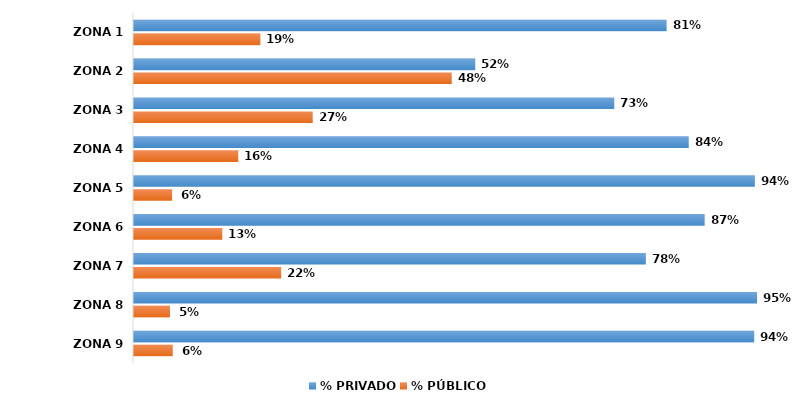
| Category | % PRIVADO | % PÚBLICO |
|---|---|---|
| ZONA 1 | 0.808 | 0.192 |
| ZONA 2 | 0.518 | 0.482 |
| ZONA 3 | 0.729 | 0.271 |
| ZONA 4 | 0.842 | 0.158 |
| ZONA 5 | 0.942 | 0.058 |
| ZONA 6 | 0.866 | 0.134 |
| ZONA 7 | 0.777 | 0.223 |
| ZONA 8 | 0.945 | 0.055 |
| ZONA 9 | 0.941 | 0.059 |